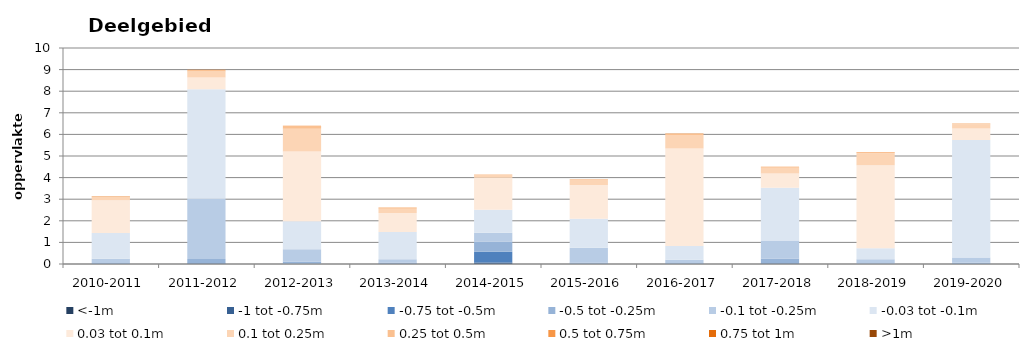
| Category | <-1m | -1 tot -0.75m | -0.75 tot -0.5m | -0.5 tot -0.25m | -0.1 tot -0.25m | -0.03 tot -0.1m | 0.03 tot 0.1m | 0.1 tot 0.25m | 0.25 tot 0.5m | 0.5 tot 0.75m | 0.75 tot 1m | >1m |
|---|---|---|---|---|---|---|---|---|---|---|---|---|
| 2010-2011 | 0 | 0 | 0.003 | 0.038 | 0.203 | 1.195 | 1.509 | 0.126 | 0.032 | 0.011 | 0.003 | 0.001 |
| 2011-2012 | 0 | 0.011 | 0.026 | 0.19 | 2.806 | 5.06 | 0.544 | 0.276 | 0.073 | 0.008 | 0 | 0 |
| 2012-2013 | 0.002 | 0.003 | 0.012 | 0.101 | 0.56 | 1.298 | 3.237 | 1.05 | 0.129 | 0.01 | 0.003 | 0 |
| 2013-2014 | 0 | 0.004 | 0.018 | 0.046 | 0.149 | 1.269 | 0.88 | 0.196 | 0.04 | 0.009 | 0.002 | 0 |
| 2014-2015 | 0.003 | 0.061 | 0.502 | 0.459 | 0.428 | 1.055 | 1.482 | 0.134 | 0.022 | 0.001 | 0 | 0 |
| 2015-2016 | 0 | 0.002 | 0.014 | 0.053 | 0.681 | 1.348 | 1.562 | 0.228 | 0.03 | 0.003 | 0 | 0 |
| 2016-2017 | 0.001 | 0.002 | 0.005 | 0.039 | 0.148 | 0.64 | 4.518 | 0.62 | 0.059 | 0.004 | 0.001 | 0 |
| 2017-2018 | 0.001 | 0.008 | 0.023 | 0.223 | 0.831 | 2.438 | 0.668 | 0.261 | 0.04 | 0.002 | 0 | 0 |
| 2018-2019 | 0 | 0 | 0.002 | 0.029 | 0.188 | 0.508 | 3.842 | 0.556 | 0.052 | 0.004 | 0.001 | 0 |
| 2019-2020 | 0 | 0 | 0.002 | 0.053 | 0.249 | 5.435 | 0.538 | 0.188 | 0.031 | 0.004 | 0.001 | 0.002 |